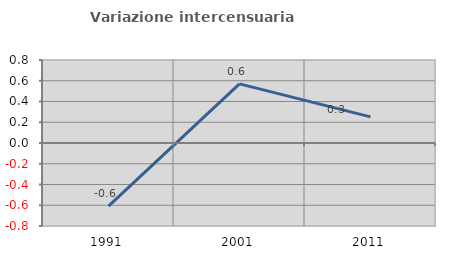
| Category | Variazione intercensuaria annua |
|---|---|
| 1991.0 | -0.609 |
| 2001.0 | 0.57 |
| 2011.0 | 0.252 |